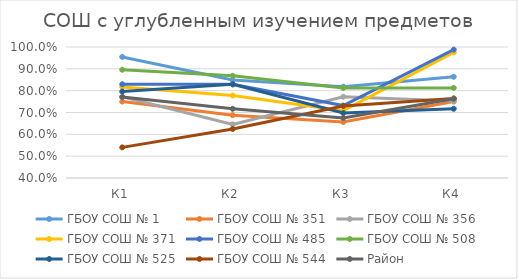
| Category | ГБОУ СОШ № 1 | ГБОУ СОШ № 351 | ГБОУ СОШ № 356 | ГБОУ СОШ № 371 | ГБОУ СОШ № 485 | ГБОУ СОШ № 508 | ГБОУ СОШ № 525 | ГБОУ СОШ № 544 | Район |
|---|---|---|---|---|---|---|---|---|---|
| К1 | 0.955 | 0.75 | 0.772 | 0.817 | 0.829 | 0.896 | 0.796 | 0.54 | 0.771 |
| К2 | 0.848 | 0.688 | 0.646 | 0.778 | 0.829 | 0.868 | 0.829 | 0.625 | 0.717 |
| К3 | 0.818 | 0.656 | 0.772 | 0.708 | 0.732 | 0.812 | 0.697 | 0.73 | 0.675 |
| К4 | 0.864 | 0.75 | 0.753 | 0.975 | 0.988 | 0.812 | 0.717 | 0.764 | 0.763 |